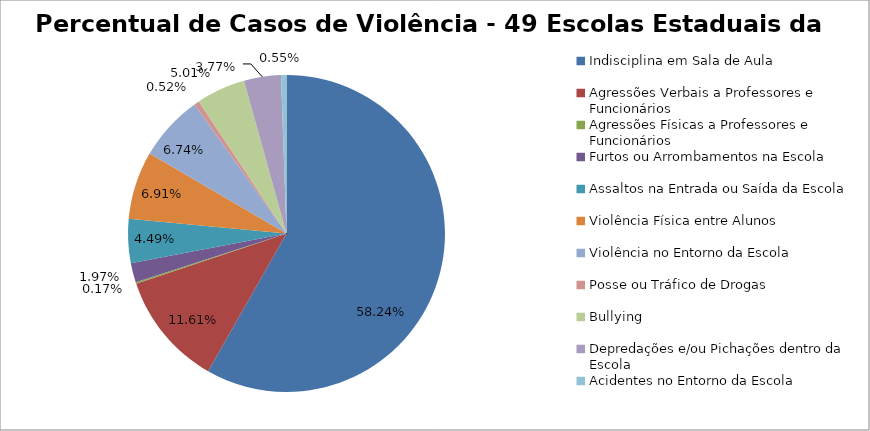
| Category | Percentual |
|---|---|
| Indisciplina em Sala de Aula | 0.582 |
| Agressões Verbais a Professores e Funcionários | 0.116 |
| Agressões Físicas a Professores e Funcionários | 0.002 |
| Furtos ou Arrombamentos na Escola | 0.02 |
| Assaltos na Entrada ou Saída da Escola | 0.045 |
| Violência Física entre Alunos | 0.069 |
| Violência no Entorno da Escola | 0.067 |
| Posse ou Tráfico de Drogas | 0.005 |
| Bullying | 0.05 |
| Depredações e/ou Pichações dentro da Escola | 0.038 |
| Acidentes no Entorno da Escola | 0.006 |